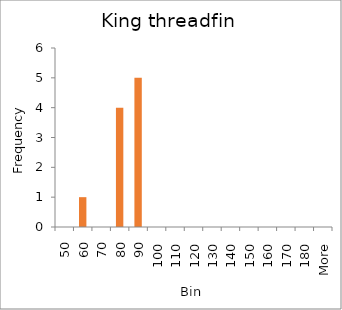
| Category | Frequency |
|---|---|
| 50 | 0 |
| 60 | 1 |
| 70 | 0 |
| 80 | 4 |
| 90 | 5 |
| 100 | 0 |
| 110 | 0 |
| 120 | 0 |
| 130 | 0 |
| 140 | 0 |
| 150 | 0 |
| 160 | 0 |
| 170 | 0 |
| 180 | 0 |
| More | 0 |